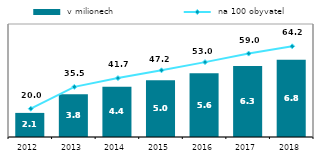
| Category |  v milionech |
|---|---|
| 2012.0 | 2.133 |
| 2013.0 | 3.778 |
| 2014.0 | 4.442 |
| 2015.0 | 5.032 |
| 2016.0 | 5.646 |
| 2017.0 | 6.288 |
| 2018.0 | 6.839 |